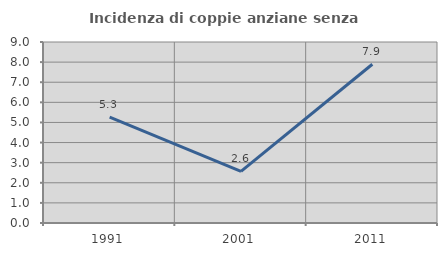
| Category | Incidenza di coppie anziane senza figli  |
|---|---|
| 1991.0 | 5.263 |
| 2001.0 | 2.564 |
| 2011.0 | 7.895 |